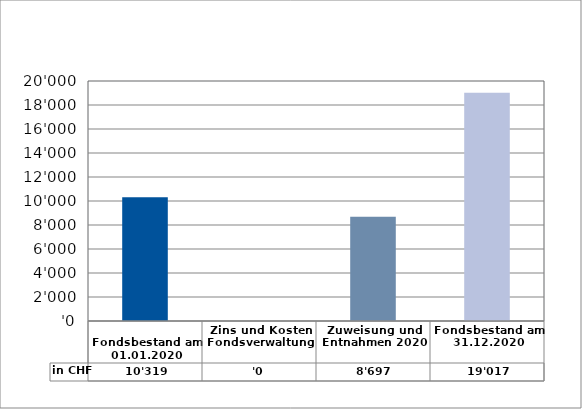
| Category | in CHF |
|---|---|
| 
Fondsbestand am 01.01.2020

 | 10319.15 |
| Zins und Kosten Fondsverwaltung | 0 |
| Zuweisung und Entnahmen 2020 | 8697.35 |
| Fondsbestand am 31.12.2020 | 19016.5 |